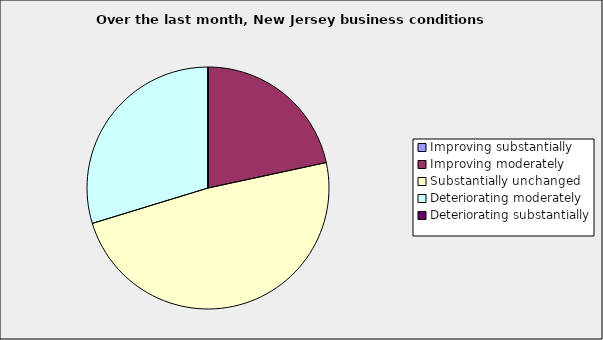
| Category | Series 0 |
|---|---|
| Improving substantially | 0 |
| Improving moderately | 0.216 |
| Substantially unchanged | 0.486 |
| Deteriorating moderately | 0.297 |
| Deteriorating substantially | 0 |